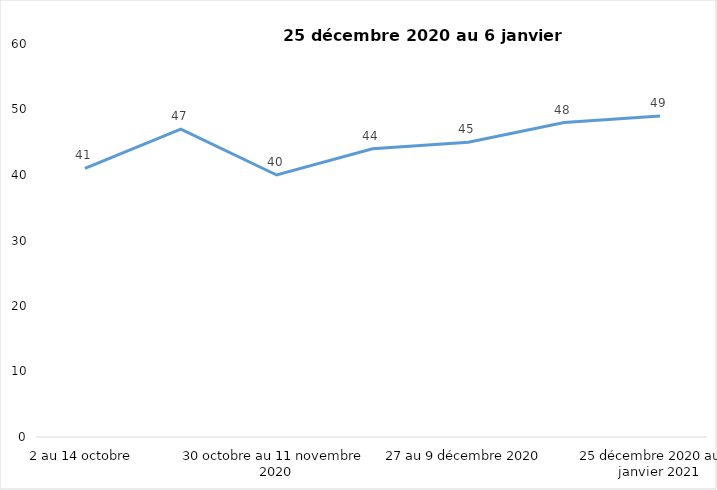
| Category | Toujours aux trois mesures |
|---|---|
| 2 au 14 octobre | 41 |
| 16 au 28 octobre 2020 | 47 |
| 30 octobre au 11 novembre 2020 | 40 |
| 13 au 25 novembre 2020 | 44 |
| 27 au 9 décembre 2020 | 45 |
| 11 au 25 décembre 2020 | 48 |
| 25 décembre 2020 au 6 janvier 2021 | 49 |